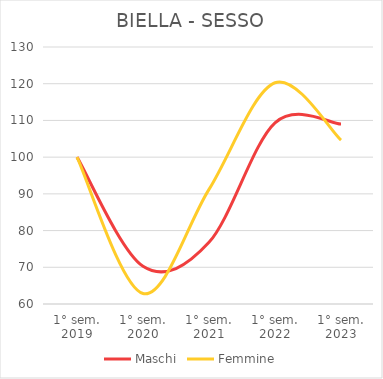
| Category | Maschi | Femmine |
|---|---|---|
| 1° sem.
2019 | 100 | 100 |
| 1° sem.
2020 | 70.284 | 62.839 |
| 1° sem.
2021 | 76.795 | 91.226 |
| 1° sem.
2022 | 109.349 | 120.258 |
| 1° sem.
2023 | 109.015 | 104.645 |